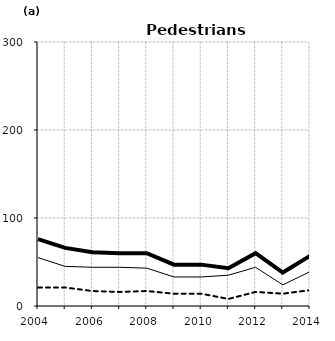
| Category | Built-up | Non built-up | Total |
|---|---|---|---|
| 2004.0 | 55 | 21 | 76 |
| 2005.0 | 45 | 21 | 66 |
| 2006.0 | 44 | 17 | 61 |
| 2007.0 | 44 | 16 | 60 |
| 2008.0 | 43 | 17 | 60 |
| 2009.0 | 33 | 14 | 47 |
| 2010.0 | 33 | 14 | 47 |
| 2011.0 | 35 | 8 | 43 |
| 2012.0 | 44 | 16 | 60 |
| 2013.0 | 24 | 14 | 38 |
| 2014.0 | 39 | 18 | 57 |